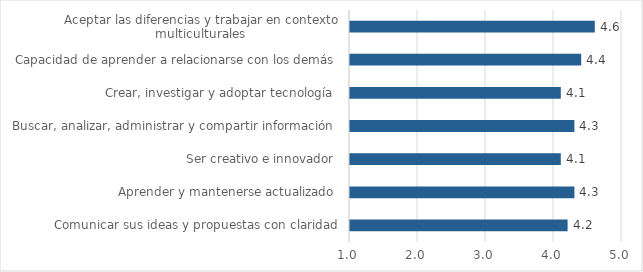
| Category | Series 5 | Promedio |
|---|---|---|
| Comunicar sus ideas y propuestas con claridad |  | 4.2 |
| Aprender y mantenerse actualizado  |  | 4.3 |
| Ser creativo e innovador  |  | 4.1 |
| Buscar, analizar, administrar y compartir información  |  | 4.3 |
| Crear, investigar y adoptar tecnología  |  | 4.1 |
| Capacidad de aprender a relacionarse con los demás  |  | 4.4 |
| Aceptar las diferencias y trabajar en contexto multiculturales  |  | 4.6 |